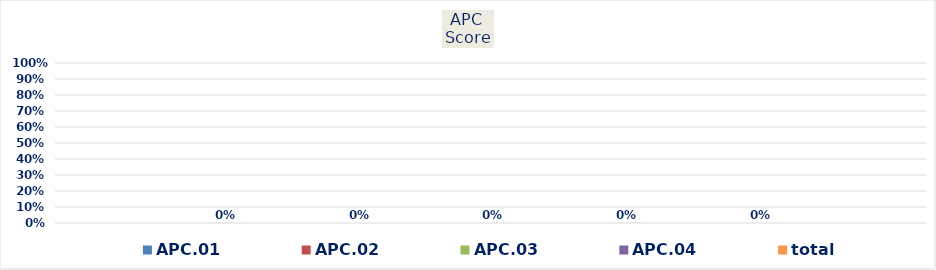
| Category | APC.01 | APC.02 | APC.03 | APC.04 | total  |
|---|---|---|---|---|---|
| 0 | 0 | 0 | 0 | 0 | 0 |